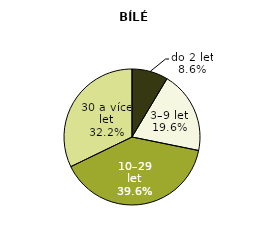
| Category | bílé odrůdy |
|---|---|
| do 2 let | 944.392 |
| 3–9 let | 2149.112 |
| 10–29 let | 4349.73 |
| 30 a více let | 3532.732 |